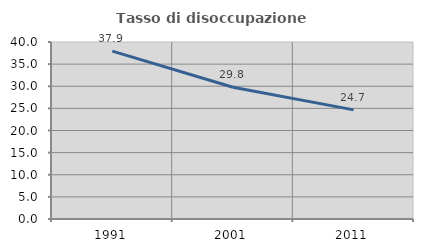
| Category | Tasso di disoccupazione giovanile  |
|---|---|
| 1991.0 | 37.948 |
| 2001.0 | 29.781 |
| 2011.0 | 24.658 |